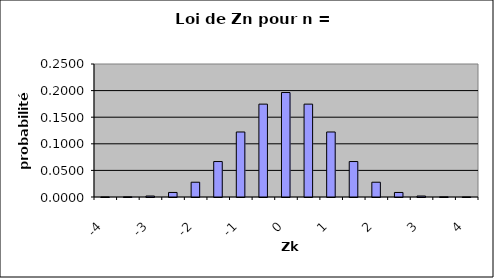
| Category | 0,0000 0,0002 0,0018 0,0085 0,0278 0,0667 0,1222 0,1746 0,1964 0,1746 0,1222 0,0667 0,0278 0,0085 0,0018 0,0002 0,0000 |
|---|---|
| -4.0 | 0 |
| -3.5 | 0 |
| -3.0 | 0.002 |
| -2.5 | 0.009 |
| -2.0 | 0.028 |
| -1.5 | 0.067 |
| -1.0 | 0.122 |
| -0.5 | 0.175 |
| 0.0 | 0.196 |
| 0.5 | 0.175 |
| 1.0 | 0.122 |
| 1.5 | 0.067 |
| 2.0 | 0.028 |
| 2.5 | 0.009 |
| 3.0 | 0.002 |
| 3.5 | 0 |
| 4.0 | 0 |